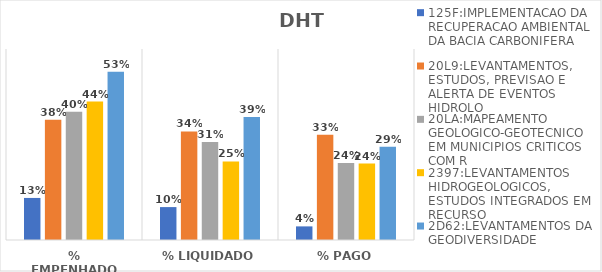
| Category | 125F:IMPLEMENTACAO DA RECUPERACAO AMBIENTAL DA BACIA CARBONIFERA | 20L9:LEVANTAMENTOS, ESTUDOS, PREVISAO E ALERTA DE EVENTOS HIDROLO | 20LA:MAPEAMENTO GEOLOGICO-GEOTECNICO EM MUNICIPIOS CRITICOS COM R | 2397:LEVANTAMENTOS HIDROGEOLOGICOS, ESTUDOS INTEGRADOS EM RECURSO | 2D62:LEVANTAMENTOS DA GEODIVERSIDADE |
|---|---|---|---|---|---|
| % EMPENHADO | 0.132 | 0.378 | 0.403 | 0.435 | 0.528 |
| % LIQUIDADO | 0.103 | 0.341 | 0.308 | 0.247 | 0.386 |
| % PAGO | 0.043 | 0.331 | 0.242 | 0.24 | 0.293 |